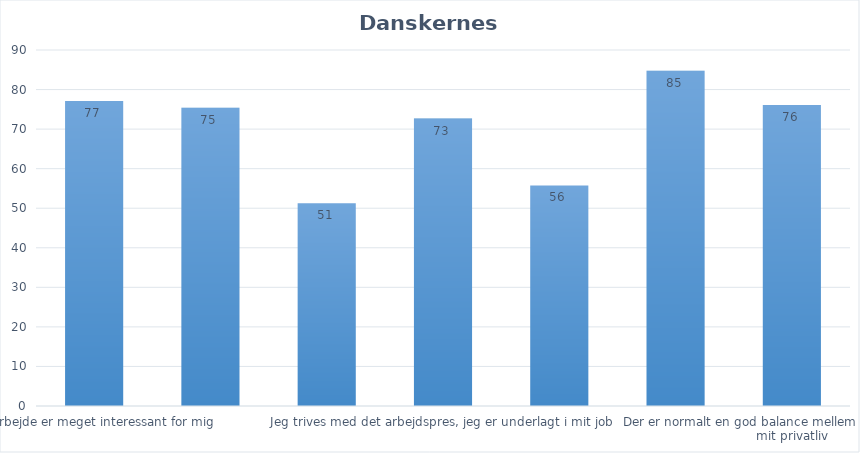
| Category | Series 0 |
|---|---|
| Mit arbejde er meget interessant for mig | 77.11 |
| Mit arbejde giver mig tilstrækkelige udfordringer | 75.37 |
| Når jeg har fri, tænker jeg sjældent på mit arbejde | 51.26 |
| Jeg trives med det arbejdspres, jeg er underlagt i mit job | 72.66 |
| Når jeg har fri, kan min arbejdsgiver altid få fat på mig via e-mail eller arbejdstelefon | 55.77 |
| Jeg har det godt med ansvaret, der følger med mit job | 84.78 |
| Der er normalt en god balance mellem mit arbejdsliv og mit privatliv | 76.09 |